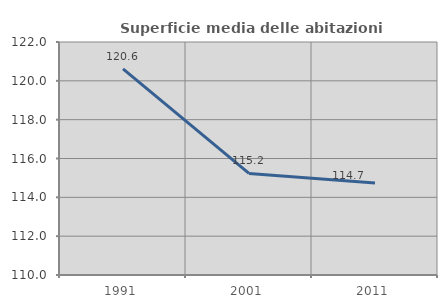
| Category | Superficie media delle abitazioni occupate |
|---|---|
| 1991.0 | 120.613 |
| 2001.0 | 115.23 |
| 2011.0 | 114.736 |